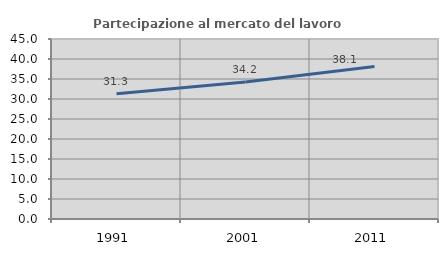
| Category | Partecipazione al mercato del lavoro  femminile |
|---|---|
| 1991.0 | 31.33 |
| 2001.0 | 34.231 |
| 2011.0 | 38.113 |